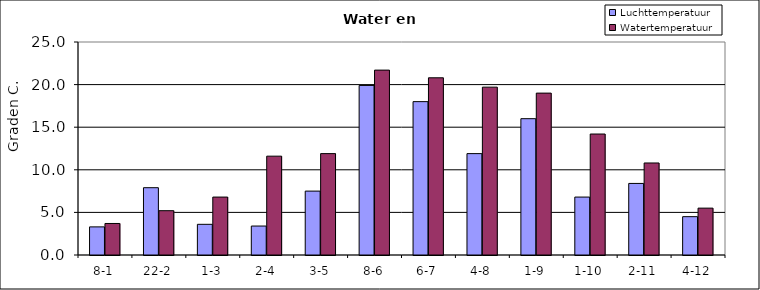
| Category | Luchttemperatuur | Watertemperatuur |
|---|---|---|
| 8-1 | 3.3 | 3.7 |
| 22-2 | 7.9 | 5.2 |
| 1-3 | 3.6 | 6.8 |
| 2-4 | 3.4 | 11.6 |
| 3-5 | 7.5 | 11.9 |
| 8-6 | 19.9 | 21.7 |
| 6-7 | 18 | 20.8 |
| 4-8 | 11.9 | 19.7 |
| 1-9 | 16 | 19 |
| 1-10 | 6.8 | 14.2 |
| 2-11 | 8.4 | 10.8 |
| 4-12 | 4.5 | 5.5 |